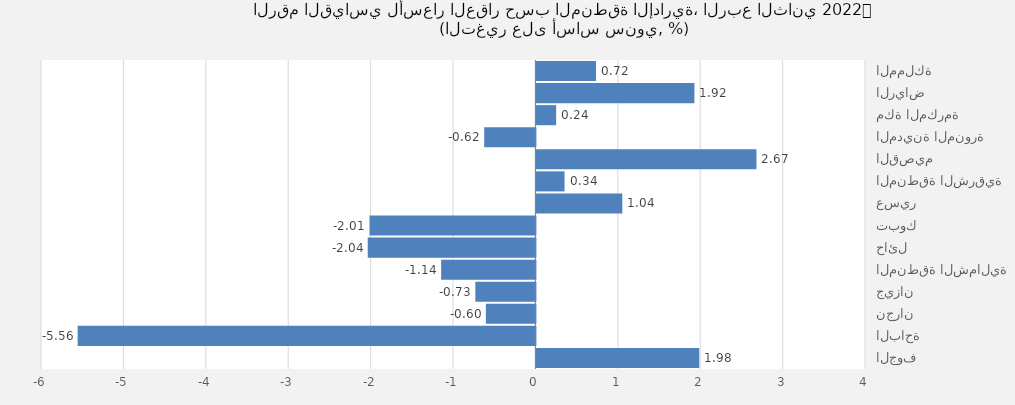
| Category | 2022 الربع الثاني |
|---|---|
| المملكة | 0.723 |
| الرياض | 1.918 |
| مكة المكرمة | 0.24 |
| المدينة المنورة | -0.621 |
| القصيم | 2.67 |
| المنطقة الشرقية | 0.342 |
| عسير | 1.043 |
| تبوك | -2.014 |
| حائل | -2.035 |
| المنطقة الشمالية | -1.144 |
| جيزان | -0.729 |
| نجران | -0.601 |
| الباحة | -5.555 |
| الجوف | 1.976 |